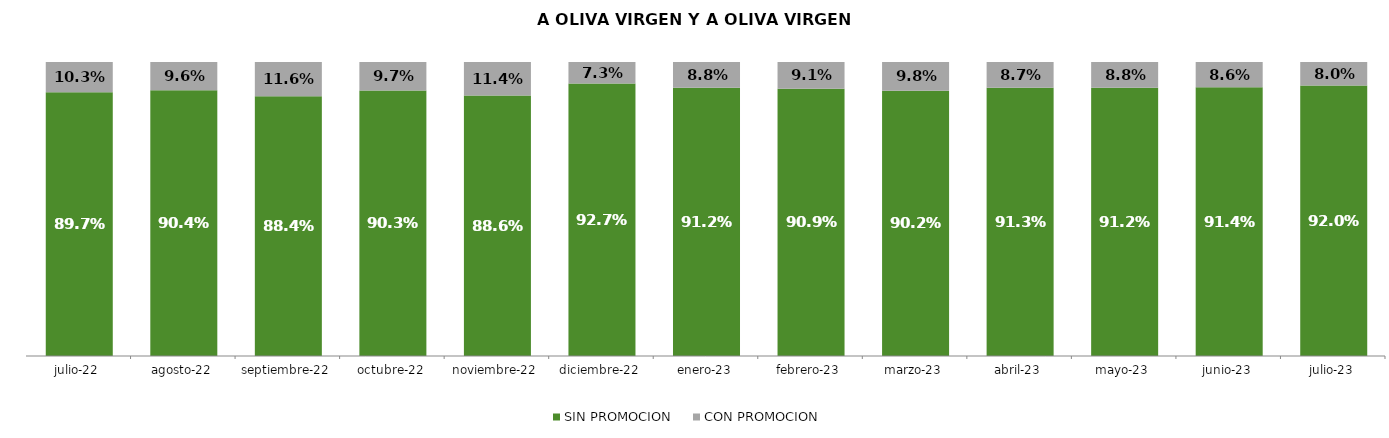
| Category | SIN PROMOCION   | CON PROMOCION   |
|---|---|---|
| 2022-07-01 | 0.897 | 0.103 |
| 2022-08-01 | 0.904 | 0.096 |
| 2022-09-01 | 0.884 | 0.116 |
| 2022-10-01 | 0.903 | 0.097 |
| 2022-11-01 | 0.886 | 0.114 |
| 2022-12-01 | 0.927 | 0.073 |
| 2023-01-01 | 0.912 | 0.088 |
| 2023-02-01 | 0.909 | 0.091 |
| 2023-03-01 | 0.902 | 0.098 |
| 2023-04-01 | 0.913 | 0.087 |
| 2023-05-01 | 0.912 | 0.088 |
| 2023-06-01 | 0.914 | 0.086 |
| 2023-07-01 | 0.92 | 0.08 |